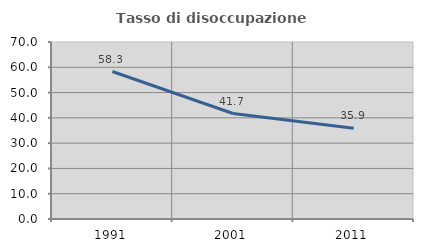
| Category | Tasso di disoccupazione giovanile  |
|---|---|
| 1991.0 | 58.333 |
| 2001.0 | 41.722 |
| 2011.0 | 35.912 |